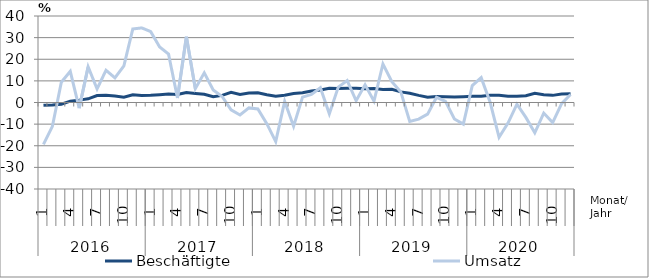
| Category | Beschäftigte | Umsatz |
|---|---|---|
| 0 | -1.3 | -19.4 |
| 1 | -1.1 | -11 |
| 2 | -0.8 | 9.4 |
| 3 | 0.6 | 14.4 |
| 4 | 1.1 | -2.6 |
| 5 | 1.7 | 16.5 |
| 6 | 3.2 | 6.3 |
| 7 | 3.4 | 14.9 |
| 8 | 3 | 11.4 |
| 9 | 2.4 | 16.9 |
| 10 | 3.6 | 34 |
| 11 | 3.2 | 34.5 |
| 12 | 3.3 | 32.8 |
| 13 | 3.6 | 25.7 |
| 14 | 3.9 | 22.4 |
| 15 | 3.7 | 2.1 |
| 16 | 4.6 | 30.4 |
| 17 | 4.2 | 6.4 |
| 18 | 3.8 | 13.7 |
| 19 | 2.7 | 5.8 |
| 20 | 3.3 | 2.8 |
| 21 | 4.7 | -3.4 |
| 22 | 3.7 | -5.8 |
| 23 | 4.4 | -2.5 |
| 24 | 4.5 | -3 |
| 25 | 3.6 | -9.8 |
| 26 | 2.9 | -18.1 |
| 27 | 3.4 | 0.5 |
| 28 | 4.2 | -11 |
| 29 | 4.5 | 2.5 |
| 30 | 5.3 | 3.7 |
| 31 | 5.8 | 6.8 |
| 32 | 6.6 | -5.2 |
| 33 | 6.5 | 7.1 |
| 34 | 6.6 | 10.1 |
| 35 | 6.6 | 0.8 |
| 36 | 6.4 | 8.2 |
| 37 | 6.5 | 0.6 |
| 38 | 6 | 17.8 |
| 39 | 6.1 | 9.6 |
| 40 | 4.9 | 4.9 |
| 41 | 4.3 | -8.8 |
| 42 | 3.3 | -7.7 |
| 43 | 2.4 | -5.4 |
| 44 | 2.8 | 2.4 |
| 45 | 2.7 | 0.5 |
| 46 | 2.5 | -7.6 |
| 47 | 2.7 | -10 |
| 48 | 2.9 | 7.8 |
| 49 | 2.9 | 11.5 |
| 50 | 3.4 | 0.1 |
| 51 | 3.4 | -16.1 |
| 52 | 2.9 | -9.5 |
| 53 | 2.9 | -0.8 |
| 54 | 3.1 | -6.9 |
| 55 | 4.3 | -14 |
| 56 | 3.6 | -4.9 |
| 57 | 3.3 | -9.3 |
| 58 | 3.9 | -0.5 |
| 59 | 4 | 3.7 |